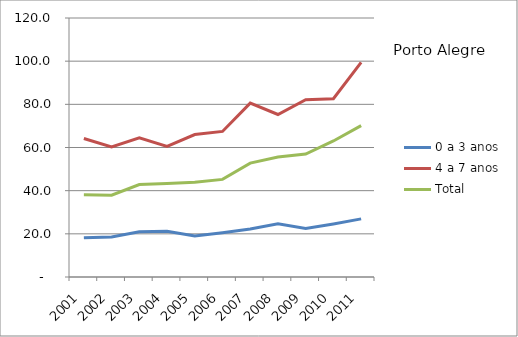
| Category | 0 a 3 anos | 4 a 7 anos | Total |
|---|---|---|---|
| 2001.0 | 18.17 | 64.16 | 38.07 |
| 2002.0 | 18.52 | 60.27 | 37.87 |
| 2003.0 | 20.99 | 64.5 | 42.85 |
| 2004.0 | 21.21 | 60.52 | 43.34 |
| 2005.0 | 19.05 | 66.02 | 43.85 |
| 2006.0 | 20.49 | 67.44 | 45.22 |
| 2007.0 | 22.21 | 80.57 | 52.77 |
| 2008.0 | 24.64 | 75.29 | 55.56 |
| 2009.0 | 22.45 | 82.17 | 56.96 |
| 2010.0 | 24.57 | 82.6 | 63.03 |
| 2011.0 | 26.93 | 99.44 | 70.14 |